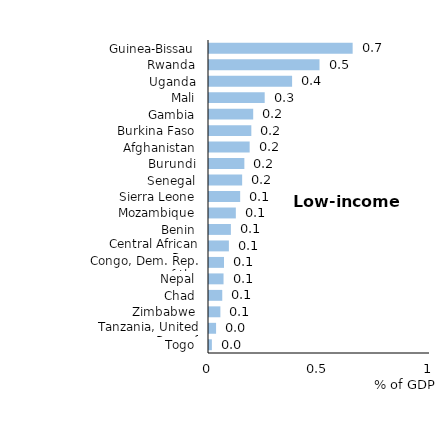
| Category | Series 0 |
|---|---|
| Togo | 0.013 |
| Tanzania, United Rep. of | 0.032 |
| Zimbabwe | 0.051 |
| Chad | 0.06 |
| Nepal | 0.066 |
| Congo, Dem. Rep. of the | 0.068 |
| Central African Rep. | 0.09 |
| Benin | 0.099 |
| Mozambique | 0.121 |
| Sierra Leone | 0.141 |
| Senegal | 0.15 |
| Burundi | 0.16 |
| Afghanistan | 0.184 |
| Burkina Faso | 0.192 |
| Gambia | 0.2 |
| Mali | 0.252 |
| Uganda | 0.376 |
| Rwanda | 0.5 |
| Guinea-Bissau | 0.65 |